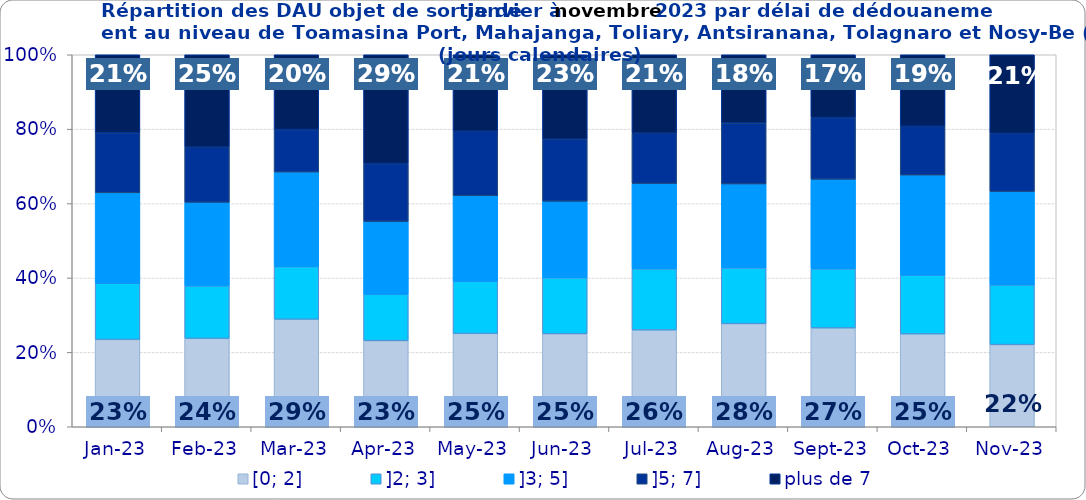
| Category | [0; 2] | ]2; 3] | ]3; 5] | ]5; 7] | plus de 7 |
|---|---|---|---|---|---|
| 2023-01-01 | 0.235 | 0.151 | 0.243 | 0.162 | 0.21 |
| 2023-02-01 | 0.238 | 0.141 | 0.225 | 0.148 | 0.248 |
| 2023-03-01 | 0.289 | 0.141 | 0.255 | 0.114 | 0.201 |
| 2023-04-01 | 0.231 | 0.124 | 0.196 | 0.155 | 0.293 |
| 2023-05-01 | 0.251 | 0.14 | 0.23 | 0.173 | 0.205 |
| 2023-06-01 | 0.25 | 0.151 | 0.206 | 0.167 | 0.227 |
| 2023-07-01 | 0.26 | 0.164 | 0.229 | 0.135 | 0.211 |
| 2023-08-01 | 0.277 | 0.15 | 0.226 | 0.164 | 0.183 |
| 2023-09-01 | 0.266 | 0.159 | 0.241 | 0.165 | 0.169 |
| 2023-10-01 | 0.25 | 0.158 | 0.269 | 0.131 | 0.192 |
| 2023-11-01 | 0.221 | 0.16 | 0.251 | 0.156 | 0.211 |